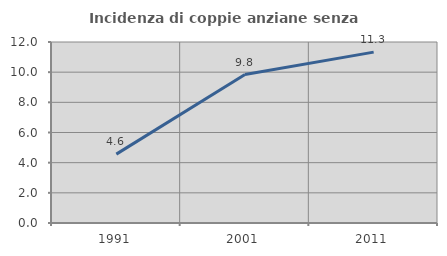
| Category | Incidenza di coppie anziane senza figli  |
|---|---|
| 1991.0 | 4.567 |
| 2001.0 | 9.843 |
| 2011.0 | 11.329 |